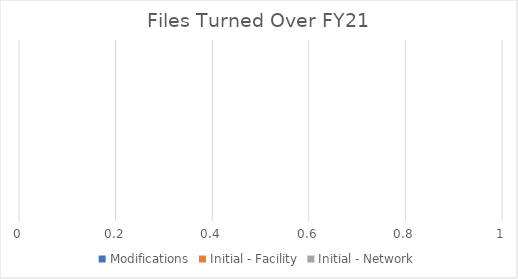
| Category | Modifications | Initial - Facility | Initial - Network |
|---|---|---|---|
|  | 0 | 0 | 0 |
|  | 0 | 0 | 0 |
|  | 0 | 0 | 0 |
|  | 0 | 0 | 0 |